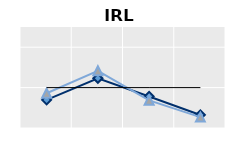
| Category | Né à l'étranger | Né dans le pays | Series 1 |
|---|---|---|---|
| 15-24 | 0.696 | 0.86 | 1 |
| 25-54 | 1.232 | 1.415 | 1 |
| 55-64 | 0.781 | 0.685 | 1 |
| 65+ | 0.323 | 0.269 | 1 |